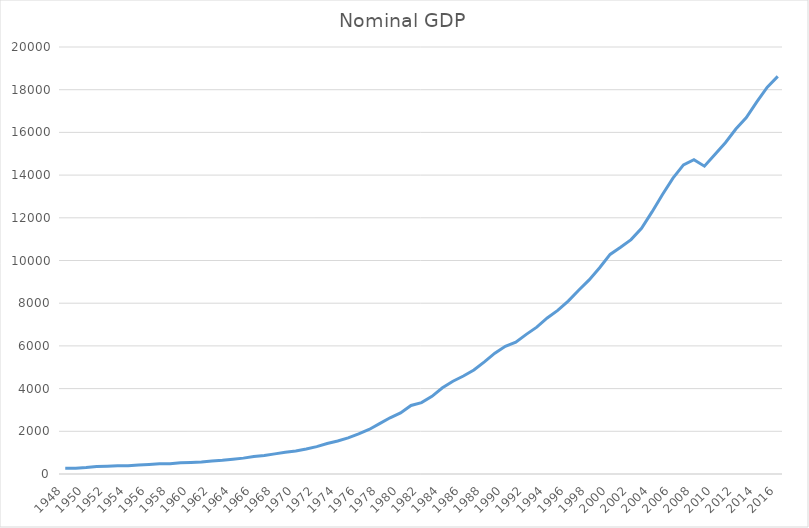
| Category | GDP |
|---|---|
| 1948.0 | 274.806 |
| 1949.0 | 272.827 |
| 1950.0 | 300.194 |
| 1951.0 | 347.295 |
| 1952.0 | 367.734 |
| 1953.0 | 389.737 |
| 1954.0 | 391.146 |
| 1955.0 | 426.173 |
| 1956.0 | 450.131 |
| 1957.0 | 474.852 |
| 1958.0 | 482.043 |
| 1959.0 | 522.456 |
| 1960.0 | 543.28 |
| 1961.0 | 563.308 |
| 1962.0 | 605.116 |
| 1963.0 | 638.579 |
| 1964.0 | 685.784 |
| 1965.0 | 743.726 |
| 1966.0 | 815.036 |
| 1967.0 | 861.73 |
| 1968.0 | 942.477 |
| 1969.0 | 1019.884 |
| 1970.0 | 1075.89 |
| 1971.0 | 1167.766 |
| 1972.0 | 1282.447 |
| 1973.0 | 1428.539 |
| 1974.0 | 1548.819 |
| 1975.0 | 1688.92 |
| 1976.0 | 1877.592 |
| 1977.0 | 2085.951 |
| 1978.0 | 2356.569 |
| 1979.0 | 2632.139 |
| 1980.0 | 2862.508 |
| 1981.0 | 3210.947 |
| 1982.0 | 3344.993 |
| 1983.0 | 3638.136 |
| 1984.0 | 4040.69 |
| 1985.0 | 4346.744 |
| 1986.0 | 4590.153 |
| 1987.0 | 4870.217 |
| 1988.0 | 5252.63 |
| 1989.0 | 5657.695 |
| 1990.0 | 5979.584 |
| 1991.0 | 6174.05 |
| 1992.0 | 6539.3 |
| 1993.0 | 6878.711 |
| 1994.0 | 7308.756 |
| 1995.0 | 7664.061 |
| 1996.0 | 8100.201 |
| 1997.0 | 8608.519 |
| 1998.0 | 9089.16 |
| 1999.0 | 9660.622 |
| 2000.0 | 10284.775 |
| 2001.0 | 10621.827 |
| 2002.0 | 10977.522 |
| 2003.0 | 11510.674 |
| 2004.0 | 12274.927 |
| 2005.0 | 13093.722 |
| 2006.0 | 13855.892 |
| 2007.0 | 14477.636 |
| 2008.0 | 14718.588 |
| 2009.0 | 14418.74 |
| 2010.0 | 14964.383 |
| 2011.0 | 15517.934 |
| 2012.0 | 16155.255 |
| 2013.0 | 16691.517 |
| 2014.0 | 17427.609 |
| 2015.0 | 18120.714 |
| 2016.0 | 18624.475 |